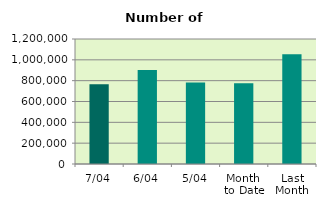
| Category | Series 0 |
|---|---|
| 7/04 | 766522 |
| 6/04 | 902050 |
| 5/04 | 782092 |
| Month 
to Date | 775658.8 |
| Last
Month | 1053589.478 |